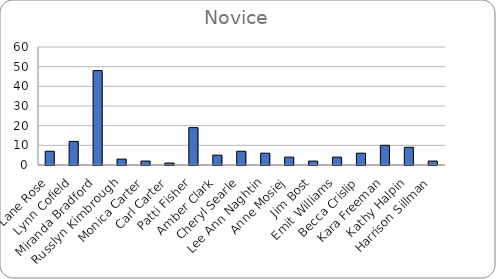
| Category | Totals |
|---|---|
| Lane Rose | 7 |
| Lynn Cofield | 12 |
| Miranda Bradford | 48 |
| Russlyn Kimbrough | 3 |
| Monica Carter | 2 |
| Carl Carter | 1 |
| Patti Fisher | 19 |
| Amber Clark | 5 |
| Cheryl Searle | 7 |
| Lee Ann Naghtin | 6 |
| Anne Mosiej | 4 |
| Jim Bost | 2 |
| Emit Williams | 4 |
| Becca Crislip | 6 |
| Kara Freeman | 10 |
| Kathy Halpin | 9 |
| Harrison Sillman | 2 |